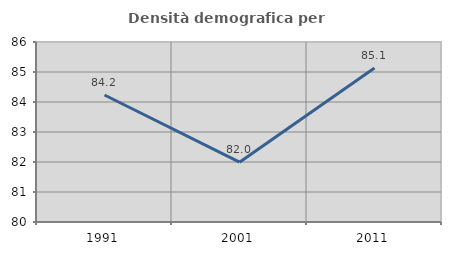
| Category | Densità demografica |
|---|---|
| 1991.0 | 84.234 |
| 2001.0 | 81.994 |
| 2011.0 | 85.13 |